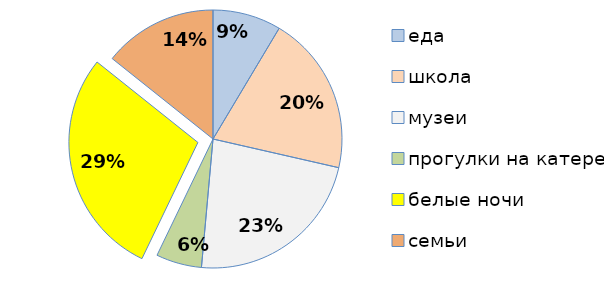
| Category | Series 0 |
|---|---|
| еда | 0.086 |
| школа | 0.2 |
| музеи | 0.229 |
| прогулки на катере | 0.057 |
| белые ночи | 0.286 |
| семьи | 0.143 |